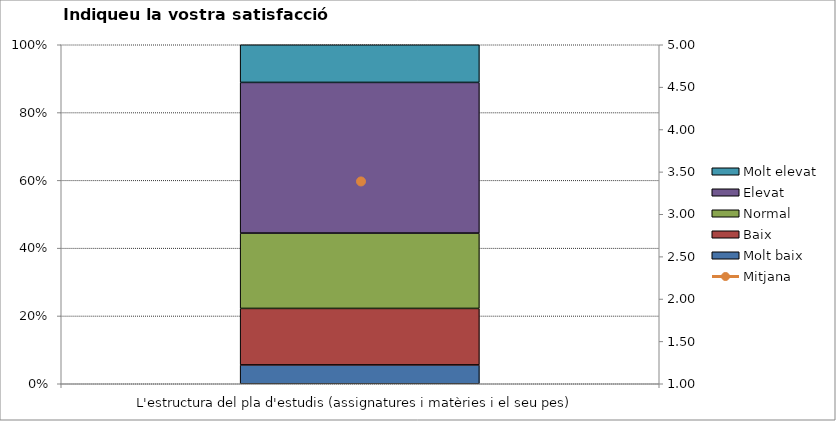
| Category | Molt baix | Baix | Normal  | Elevat | Molt elevat |
|---|---|---|---|---|---|
| L'estructura del pla d'estudis (assignatures i matèries i el seu pes) | 1 | 3 | 4 | 8 | 2 |